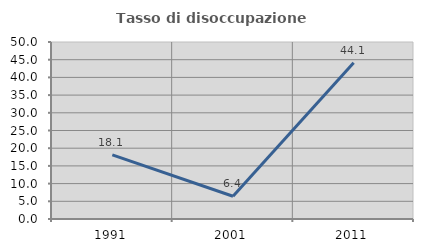
| Category | Tasso di disoccupazione giovanile  |
|---|---|
| 1991.0 | 18.132 |
| 2001.0 | 6.433 |
| 2011.0 | 44.138 |